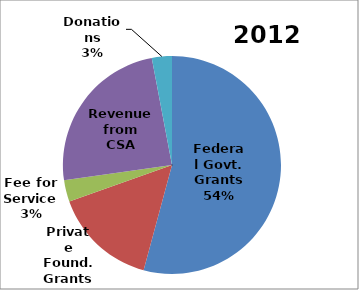
| Category | Series 0 | Series 1 |
|---|---|---|
| Federal Govt. Grants | 0.542 | 693640 |
| Private Found. Grants | 0.154 | 196737 |
| Fee for Service  | 0.032 | 40982 |
| Revenue from CSA | 0.243 | 310391 |
| Donations | 0.03 | 38069 |